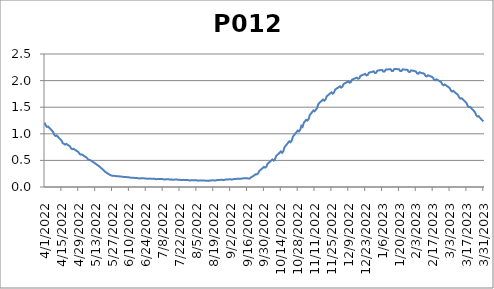
| Category | P012 |
|---|---|
| 4/1/22 | 1.21 |
| 4/2/22 | 1.154 |
| 4/3/22 | 1.13 |
| 4/4/22 | 1.135 |
| 4/5/22 | 1.111 |
| 4/6/22 | 1.087 |
| 4/7/22 | 1.062 |
| 4/8/22 | 1.039 |
| 4/9/22 | 0.983 |
| 4/10/22 | 0.959 |
| 4/11/22 | 0.969 |
| 4/12/22 | 0.945 |
| 4/13/22 | 0.921 |
| 4/14/22 | 0.899 |
| 4/15/22 | 0.875 |
| 4/16/22 | 0.826 |
| 4/17/22 | 0.812 |
| 4/18/22 | 0.797 |
| 4/19/22 | 0.811 |
| 4/20/22 | 0.795 |
| 4/21/22 | 0.779 |
| 4/22/22 | 0.765 |
| 4/23/22 | 0.724 |
| 4/24/22 | 0.709 |
| 4/25/22 | 0.718 |
| 4/26/22 | 0.703 |
| 4/27/22 | 0.687 |
| 4/28/22 | 0.673 |
| 4/29/22 | 0.658 |
| 4/30/22 | 0.624 |
| 5/1/22 | 0.609 |
| 5/2/22 | 0.611 |
| 5/3/22 | 0.596 |
| 5/4/22 | 0.581 |
| 5/5/22 | 0.565 |
| 5/6/22 | 0.55 |
| 5/7/22 | 0.522 |
| 5/8/22 | 0.507 |
| 5/9/22 | 0.503 |
| 5/10/22 | 0.487 |
| 5/11/22 | 0.472 |
| 5/12/22 | 0.458 |
| 5/13/22 | 0.443 |
| 5/14/22 | 0.424 |
| 5/15/22 | 0.41 |
| 5/16/22 | 0.395 |
| 5/17/22 | 0.375 |
| 5/18/22 | 0.354 |
| 5/19/22 | 0.335 |
| 5/20/22 | 0.315 |
| 5/21/22 | 0.29 |
| 5/22/22 | 0.276 |
| 5/23/22 | 0.258 |
| 5/24/22 | 0.245 |
| 5/25/22 | 0.231 |
| 5/26/22 | 0.22 |
| 5/27/22 | 0.212 |
| 5/28/22 | 0.211 |
| 5/29/22 | 0.209 |
| 5/30/22 | 0.205 |
| 5/31/22 | 0.203 |
| 6/1/22 | 0.202 |
| 6/2/22 | 0.2 |
| 6/3/22 | 0.197 |
| 6/4/22 | 0.194 |
| 6/5/22 | 0.192 |
| 6/6/22 | 0.189 |
| 6/7/22 | 0.188 |
| 6/8/22 | 0.186 |
| 6/9/22 | 0.184 |
| 6/10/22 | 0.181 |
| 6/11/22 | 0.176 |
| 6/12/22 | 0.173 |
| 6/13/22 | 0.175 |
| 6/14/22 | 0.172 |
| 6/15/22 | 0.17 |
| 6/16/22 | 0.169 |
| 6/17/22 | 0.168 |
| 6/18/22 | 0.162 |
| 6/19/22 | 0.161 |
| 6/20/22 | 0.165 |
| 6/21/22 | 0.164 |
| 6/22/22 | 0.163 |
| 6/23/22 | 0.162 |
| 6/24/22 | 0.161 |
| 6/25/22 | 0.155 |
| 6/26/22 | 0.154 |
| 6/27/22 | 0.158 |
| 6/28/22 | 0.157 |
| 6/29/22 | 0.156 |
| 6/30/22 | 0.155 |
| 7/1/22 | 0.154 |
| 7/2/22 | 0.148 |
| 7/3/22 | 0.147 |
| 7/4/22 | 0.152 |
| 7/5/22 | 0.151 |
| 7/6/22 | 0.15 |
| 7/7/22 | 0.149 |
| 7/8/22 | 0.149 |
| 7/9/22 | 0.142 |
| 7/10/22 | 0.142 |
| 7/11/22 | 0.146 |
| 7/12/22 | 0.146 |
| 7/13/22 | 0.145 |
| 7/14/22 | 0.139 |
| 7/15/22 | 0.144 |
| 7/16/22 | 0.137 |
| 7/17/22 | 0.136 |
| 7/18/22 | 0.141 |
| 7/19/22 | 0.14 |
| 7/20/22 | 0.139 |
| 7/21/22 | 0.138 |
| 7/22/22 | 0.137 |
| 7/23/22 | 0.13 |
| 7/24/22 | 0.129 |
| 7/25/22 | 0.134 |
| 7/26/22 | 0.133 |
| 7/27/22 | 0.133 |
| 7/28/22 | 0.132 |
| 7/29/22 | 0.131 |
| 7/30/22 | 0.124 |
| 7/31/22 | 0.124 |
| 8/1/22 | 0.129 |
| 8/2/22 | 0.129 |
| 8/3/22 | 0.128 |
| 8/4/22 | 0.127 |
| 8/5/22 | 0.127 |
| 8/6/22 | 0.12 |
| 8/7/22 | 0.12 |
| 8/8/22 | 0.125 |
| 8/9/22 | 0.124 |
| 8/10/22 | 0.123 |
| 8/11/22 | 0.123 |
| 8/12/22 | 0.122 |
| 8/13/22 | 0.116 |
| 8/14/22 | 0.116 |
| 8/15/22 | 0.115 |
| 8/16/22 | 0.122 |
| 8/17/22 | 0.123 |
| 8/18/22 | 0.125 |
| 8/19/22 | 0.126 |
| 8/20/22 | 0.122 |
| 8/21/22 | 0.123 |
| 8/22/22 | 0.13 |
| 8/23/22 | 0.131 |
| 8/24/22 | 0.133 |
| 8/25/22 | 0.134 |
| 8/26/22 | 0.136 |
| 8/27/22 | 0.132 |
| 8/28/22 | 0.133 |
| 8/29/22 | 0.14 |
| 8/30/22 | 0.142 |
| 8/31/22 | 0.143 |
| 9/1/22 | 0.143 |
| 9/2/22 | 0.145 |
| 9/3/22 | 0.141 |
| 9/4/22 | 0.143 |
| 9/5/22 | 0.15 |
| 9/6/22 | 0.151 |
| 9/7/22 | 0.153 |
| 9/8/22 | 0.154 |
| 9/9/22 | 0.156 |
| 9/10/22 | 0.153 |
| 9/11/22 | 0.154 |
| 9/12/22 | 0.161 |
| 9/13/22 | 0.163 |
| 9/14/22 | 0.164 |
| 9/15/22 | 0.166 |
| 9/16/22 | 0.166 |
| 9/17/22 | 0.159 |
| 9/18/22 | 0.157 |
| 9/19/22 | 0.179 |
| 9/20/22 | 0.191 |
| 9/21/22 | 0.203 |
| 9/22/22 | 0.221 |
| 9/23/22 | 0.24 |
| 9/24/22 | 0.236 |
| 9/25/22 | 0.254 |
| 9/26/22 | 0.3 |
| 9/27/22 | 0.319 |
| 9/28/22 | 0.339 |
| 9/29/22 | 0.358 |
| 9/30/22 | 0.377 |
| 10/1/22 | 0.365 |
| 10/2/22 | 0.383 |
| 10/3/22 | 0.437 |
| 10/4/22 | 0.457 |
| 10/5/22 | 0.476 |
| 10/6/22 | 0.497 |
| 10/7/22 | 0.517 |
| 10/8/22 | 0.496 |
| 10/9/22 | 0.516 |
| 10/10/22 | 0.579 |
| 10/11/22 | 0.601 |
| 10/12/22 | 0.622 |
| 10/13/22 | 0.645 |
| 10/14/22 | 0.669 |
| 10/15/22 | 0.642 |
| 10/16/22 | 0.67 |
| 10/17/22 | 0.747 |
| 10/18/22 | 0.776 |
| 10/19/22 | 0.804 |
| 10/20/22 | 0.832 |
| 10/21/22 | 0.86 |
| 10/22/22 | 0.842 |
| 10/23/22 | 0.87 |
| 10/24/22 | 0.947 |
| 10/25/22 | 0.976 |
| 10/26/22 | 1.004 |
| 10/27/22 | 1.033 |
| 10/28/22 | 1.062 |
| 10/29/22 | 1.045 |
| 10/30/22 | 1.075 |
| 10/31/22 | 1.15 |
| 11/1/22 | 1.13 |
| 11/2/22 | 1.205 |
| 11/3/22 | 1.235 |
| 11/4/22 | 1.263 |
| 11/5/22 | 1.249 |
| 11/6/22 | 1.277 |
| 11/7/22 | 1.351 |
| 11/8/22 | 1.381 |
| 11/9/22 | 1.41 |
| 11/10/22 | 1.439 |
| 11/11/22 | 1.423 |
| 11/12/22 | 1.453 |
| 11/13/22 | 1.482 |
| 11/14/22 | 1.553 |
| 11/15/22 | 1.583 |
| 11/16/22 | 1.603 |
| 11/17/22 | 1.624 |
| 11/18/22 | 1.645 |
| 11/19/22 | 1.623 |
| 11/20/22 | 1.643 |
| 11/21/22 | 1.704 |
| 11/22/22 | 1.723 |
| 11/23/22 | 1.742 |
| 11/24/22 | 1.761 |
| 11/25/22 | 1.779 |
| 11/26/22 | 1.756 |
| 11/27/22 | 1.774 |
| 11/28/22 | 1.831 |
| 11/29/22 | 1.847 |
| 11/30/22 | 1.862 |
| 12/1/22 | 1.878 |
| 12/2/22 | 1.893 |
| 12/3/22 | 1.87 |
| 12/4/22 | 1.884 |
| 12/5/22 | 1.936 |
| 12/6/22 | 1.947 |
| 12/7/22 | 1.961 |
| 12/8/22 | 1.973 |
| 12/9/22 | 1.985 |
| 12/10/22 | 1.959 |
| 12/11/22 | 1.971 |
| 12/12/22 | 2.018 |
| 12/13/22 | 2.027 |
| 12/14/22 | 2.036 |
| 12/15/22 | 2.047 |
| 12/16/22 | 2.056 |
| 12/17/22 | 2.034 |
| 12/18/22 | 2.043 |
| 12/19/22 | 2.09 |
| 12/20/22 | 2.098 |
| 12/21/22 | 2.108 |
| 12/22/22 | 2.116 |
| 12/23/22 | 2.126 |
| 12/24/22 | 2.098 |
| 12/25/22 | 2.105 |
| 12/26/22 | 2.148 |
| 12/27/22 | 2.155 |
| 12/28/22 | 2.161 |
| 12/29/22 | 2.167 |
| 12/30/22 | 2.175 |
| 12/31/22 | 2.143 |
| 1/1/23 | 2.147 |
| 1/2/23 | 2.186 |
| 1/3/23 | 2.191 |
| 1/4/23 | 2.194 |
| 1/5/23 | 2.197 |
| 1/6/23 | 2.2 |
| 1/7/23 | 2.169 |
| 1/8/23 | 2.17 |
| 1/9/23 | 2.207 |
| 1/10/23 | 2.21 |
| 1/11/23 | 2.211 |
| 1/12/23 | 2.213 |
| 1/13/23 | 2.214 |
| 1/14/23 | 2.18 |
| 1/15/23 | 2.181 |
| 1/16/23 | 2.216 |
| 1/17/23 | 2.216 |
| 1/18/23 | 2.216 |
| 1/19/23 | 2.215 |
| 1/20/23 | 2.214 |
| 1/21/23 | 2.179 |
| 1/22/23 | 2.179 |
| 1/23/23 | 2.211 |
| 1/24/23 | 2.209 |
| 1/25/23 | 2.206 |
| 1/26/23 | 2.204 |
| 1/27/23 | 2.202 |
| 1/28/23 | 2.166 |
| 1/29/23 | 2.162 |
| 1/30/23 | 2.192 |
| 1/31/23 | 2.188 |
| 2/1/23 | 2.184 |
| 2/2/23 | 2.178 |
| 2/3/23 | 2.173 |
| 2/4/23 | 2.135 |
| 2/5/23 | 2.13 |
| 2/6/23 | 2.156 |
| 2/7/23 | 2.15 |
| 2/8/23 | 2.143 |
| 2/9/23 | 2.135 |
| 2/10/23 | 2.128 |
| 2/11/23 | 2.088 |
| 2/12/23 | 2.079 |
| 2/13/23 | 2.1 |
| 2/14/23 | 2.091 |
| 2/15/23 | 2.082 |
| 2/16/23 | 2.072 |
| 2/17/23 | 2.06 |
| 2/18/23 | 2.018 |
| 2/19/23 | 2.006 |
| 2/20/23 | 2.025 |
| 2/21/23 | 2.012 |
| 2/22/23 | 1.999 |
| 2/23/23 | 1.985 |
| 2/24/23 | 1.971 |
| 2/25/23 | 1.927 |
| 2/26/23 | 1.912 |
| 2/27/23 | 1.927 |
| 2/28/23 | 1.91 |
| 3/1/23 | 1.893 |
| 3/2/23 | 1.878 |
| 3/3/23 | 1.86 |
| 3/4/23 | 1.813 |
| 3/5/23 | 1.795 |
| 3/6/23 | 1.806 |
| 3/7/23 | 1.787 |
| 3/8/23 | 1.768 |
| 3/9/23 | 1.748 |
| 3/10/23 | 1.729 |
| 3/11/23 | 1.68 |
| 3/12/23 | 1.662 |
| 3/13/23 | 1.668 |
| 3/14/23 | 1.647 |
| 3/15/23 | 1.625 |
| 3/16/23 | 1.602 |
| 3/17/23 | 1.578 |
| 3/18/23 | 1.525 |
| 3/19/23 | 1.501 |
| 3/20/23 | 1.506 |
| 3/21/23 | 1.481 |
| 3/22/23 | 1.456 |
| 3/23/23 | 1.432 |
| 3/24/23 | 1.405 |
| 3/25/23 | 1.352 |
| 3/26/23 | 1.326 |
| 3/27/23 | 1.332 |
| 3/28/23 | 1.307 |
| 3/29/23 | 1.281 |
| 3/30/23 | 1.257 |
| 3/31/23 | 1.232 |